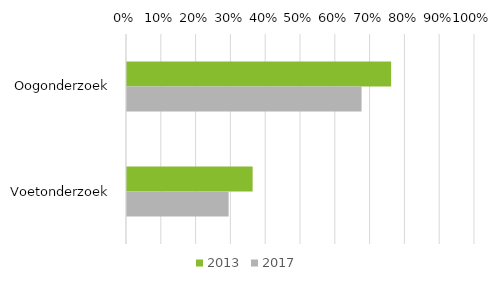
| Category | 2013 | 2017 |
|---|---|---|
| Oogonderzoek | 0.759 | 0.674 |
| Voetonderzoek | 0.361 | 0.292 |